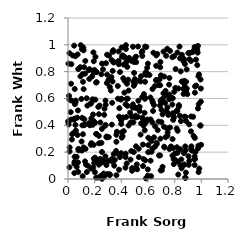
| Category | Series 0 |
|---|---|
| 0.03563302966450452 | 0.921 |
| 0.15725470546570997 | 0.416 |
| 0.30591438788167596 | 0.312 |
| 0.44442905802895954 | 0.835 |
| 0.5340514019186466 | 0.734 |
| 0.07893503927534722 | 0.213 |
| 0.6254720741834504 | 0.283 |
| 0.9351083508665092 | 0.946 |
| 0.5096278023998341 | 0.083 |
| 0.7646215727333777 | 0.384 |
| 0.44600414170575103 | 0.545 |
| 0.7216394145949058 | 0.764 |
| 0.8320018416825582 | 0.55 |
| 0.32900688421911745 | 0.406 |
| 0.709395573126925 | 0.482 |
| 0.2827878612417799 | 0.402 |
| 0.5443690685158465 | 0.727 |
| 0.6652407143829242 | 0.26 |
| 0.4169189847666831 | 0.853 |
| 0.5574837324675022 | 0.456 |
| 0.40282279622567524 | 0.308 |
| 0.6108446168091833 | 0.774 |
| 0.8815692867406937 | 0.462 |
| 0.012519489059148002 | 0.235 |
| 0.10437489069999399 | 0.967 |
| 0.7888248850764427 | 0.44 |
| 0.5953873154129009 | 0.443 |
| 0.1165228921376896 | 0.235 |
| 0.0777591043655525 | 0.225 |
| 0.49057272217372655 | 0.422 |
| 0.5478502889428372 | 0.766 |
| 0.19061189964677616 | 0.943 |
| 0.9052758802610906 | 0.105 |
| 0.07208225706951615 | 0.929 |
| 0.5364906254664229 | 0.538 |
| 0.34676503743022435 | 0.099 |
| 0.34072524804923493 | 0.95 |
| 0.4935841741137938 | 0.201 |
| 0.6264411466432885 | 0.203 |
| 0.07679006643516732 | 0.819 |
| 0.05717907458786809 | 0.584 |
| 0.700557759395515 | 0.425 |
| 0.5834725574929299 | 0.796 |
| 0.07466112687250843 | 0.511 |
| 0.7198555151066441 | 0.389 |
| 0.8417674934536472 | 0.222 |
| 0.04613624099264977 | 0.994 |
| 0.1455468854350774 | 0.547 |
| 0.853430407727154 | 0.727 |
| 0.6325949767257182 | 0.422 |
| 0.20612186753274078 | 0.911 |
| 0.881762902901905 | 0.214 |
| 0.06862611128302931 | 0.457 |
| 0.8667332366656515 | 0.634 |
| 0.5444251770319276 | 0.331 |
| 0.7838020714236587 | 0.174 |
| 0.5240308898563995 | 0.463 |
| 0.8744443689488591 | 0.465 |
| 0.05657004191745656 | 0.915 |
| 0.6447943794131817 | 0.551 |
| 0.2715642921101478 | 0.478 |
| 0.3453617172842169 | 0.871 |
| 0.9234217345973891 | 0.228 |
| 0.2285788836759919 | 0.011 |
| 0.20183481233485892 | 0.051 |
| 0.12916570348441983 | 0.786 |
| 0.8670602330831357 | 0.876 |
| 0.37488271229091713 | 0.599 |
| 0.18407499231285784 | 0.594 |
| 0.20259699793496067 | 0.159 |
| 0.5113440360093787 | 0.871 |
| 0.695132469357539 | 0.064 |
| 0.18132555514791554 | 0.765 |
| 0.24702895944130027 | 0.023 |
| 0.40399143325103937 | 0.347 |
| 0.046087987345045656 | 0.443 |
| 0.506792610633061 | 0.472 |
| 0.9825010202327943 | 0.779 |
| 0.8259075600507771 | 0.13 |
| 0.652661549607466 | 0.242 |
| 0.516196099518228 | 0.109 |
| 0.8726493535969565 | 0.891 |
| 0.8147084099534795 | 0.376 |
| 0.6014727990503329 | 0.2 |
| 0.49056151615090515 | 0.725 |
| 0.19343805210877565 | 0.151 |
| 0.3799780550042329 | 0.95 |
| 0.9100119515219347 | 0.135 |
| 0.27907445741111997 | 0.397 |
| 0.8308764308485884 | 0.538 |
| 0.19651179912720457 | 0.119 |
| 0.8203457588522839 | 0.942 |
| 0.9384938945323787 | 0.464 |
| 0.1983085175587379 | 0.813 |
| 0.9420459151622673 | 0.321 |
| 0.948632118701561 | 0.966 |
| 0.02903005044382853 | 0.295 |
| 0.923114341552792 | 0.466 |
| 0.7459756437684457 | 0.322 |
| 0.4777339687497904 | 0.464 |
| 0.43054982523759133 | 0.084 |
| 0.43170767440450586 | 0.557 |
| 0.2554476945530713 | 0.001 |
| 0.4024363384870739 | 0.98 |
| 0.6966495696412025 | 0.772 |
| 0.1613771927019352 | 0.819 |
| 0.21165359271136697 | 0.796 |
| 0.3963635155993166 | 0.592 |
| 0.46941298226638856 | 0.421 |
| 0.8820308309478597 | 0.009 |
| 0.7824669315075276 | 0.908 |
| 0.44014120768382853 | 0.597 |
| 0.25041341025791447 | 0.78 |
| 0.5015383314833852 | 0.745 |
| 0.7653703418222585 | 0.955 |
| 0.20358605201255797 | 0.419 |
| 0.3630327553735267 | 0.029 |
| 0.8152538842195785 | 0.506 |
| 0.17556850507719263 | 0.267 |
| 0.4328513422570683 | 0.189 |
| 0.010266241414984313 | 0.593 |
| 0.7216116522842217 | 0.241 |
| 0.9221885897266981 | 0.355 |
| 0.5793351780751608 | 0.139 |
| 0.31307573939561534 | 0.686 |
| 0.2138391260776985 | 0.798 |
| 0.3735617436172606 | 0.693 |
| 0.011008889289695527 | 0.937 |
| 0.8846860983848713 | 0.047 |
| 0.2807629415855507 | 0.169 |
| 0.9844252891726221 | 0.078 |
| 0.7968187977232787 | 0.65 |
| 0.43157071224319604 | 0.164 |
| 0.20532045447148634 | 0.592 |
| 0.8225814183010978 | 0.359 |
| 0.7384080433089355 | 0.507 |
| 0.6728793603267023 | 0.364 |
| 0.21057979706823254 | 0.719 |
| 0.5780158165397067 | 0.987 |
| 0.5922188670633197 | 0.786 |
| 0.9788437487020605 | 0.765 |
| 0.5858339328218688 | 0.776 |
| 0.36703647269313144 | 0.352 |
| 0.23711753986353387 | 0.548 |
| 0.569033431424668 | 0.633 |
| 0.040454871515054766 | 0.342 |
| 0.974338953810855 | 0.992 |
| 0.456478630369994 | 0.89 |
| 0.24212569490626637 | 0.119 |
| 0.26909047843936196 | 0.015 |
| 0.7474323135710214 | 0.348 |
| 0.14136893046923868 | 0.052 |
| 0.9495105727749563 | 0.104 |
| 0.5275154171254685 | 0.583 |
| 0.44006459427832584 | 0.116 |
| 0.8386461248547867 | 0.471 |
| 0.6629088393247221 | 0.737 |
| 0.4957352171128078 | 0.791 |
| 0.4938256890846566 | 0.872 |
| 0.38227632549541446 | 0.855 |
| 0.049520682179997846 | 0.166 |
| 0.11745239315813702 | 0.67 |
| 0.7613593107569053 | 0.224 |
| 0.7459999700498012 | 0.534 |
| 0.8854379822208005 | 0.724 |
| 0.2542735645275871 | 0.012 |
| 0.04788185699979842 | 0.114 |
| 0.598978069813513 | 0.86 |
| 0.9795716258534691 | 0.052 |
| 0.2929157352323847 | 0.926 |
| 0.6900919024135728 | 0.548 |
| 0.10059475263461078 | 0.597 |
| 0.26254674912036746 | 0.818 |
| 0.7315642364723096 | 0.311 |
| 0.5481818017063093 | 0.415 |
| 0.5938202570976902 | 0.828 |
| 0.02793645959232622 | 0.444 |
| 0.36150511948355074 | 0.191 |
| 0.48732592023902943 | 0.986 |
| 0.5757007799252084 | 0.363 |
| 0.2676635024097591 | 0.041 |
| 0.12086776030227603 | 0.834 |
| 0.8782469905607037 | 0.009 |
| 0.8405641931578546 | 0.899 |
| 0.7950499140761986 | 0.459 |
| 0.7278126319315674 | 0.568 |
| 0.17115419369886564 | 0.255 |
| 0.022932409541389347 | 0.71 |
| 0.9694812066911285 | 0.849 |
| 0.5367169282239092 | 0.507 |
| 0.17507905280692734 | 0.451 |
| 0.3131967644961714 | 0.035 |
| 0.5669103606655168 | 0.149 |
| 0.1928892950751433 | 0.254 |
| 0.879530991236594 | 0.243 |
| 0.8271180111415063 | 0.033 |
| 0.2882903429011712 | 0.104 |
| 0.4745602771057324 | 0.208 |
| 0.7849345924758124 | 0.602 |
| 0.5025547744859902 | 0.903 |
| 0.6021950732527096 | 0.308 |
| 0.3014052505391087 | 0.135 |
| 0.4358913917001129 | 0.869 |
| 0.507910574968093 | 0.529 |
| 0.3969783337334159 | 0.44 |
| 0.2646050397892574 | 0.138 |
| 0.0005574729176645356 | 0.428 |
| 0.313532790448222 | 0.029 |
| 0.6694866761948005 | 0.932 |
| 0.342883475329843 | 0.186 |
| 0.8519406687588789 | 0.08 |
| 0.5303410280447448 | 0.226 |
| 0.5572700705394731 | 0.953 |
| 0.7009646558975562 | 0.517 |
| 0.44796516853020724 | 0.599 |
| 0.42274635812048394 | 0.907 |
| 0.012529329909304998 | 0.437 |
| 0.0245749698531523 | 0.585 |
| 0.602326077256067 | 0.252 |
| 0.6512072730822507 | 0.692 |
| 0.6233127587818089 | 0.021 |
| 0.37947488451029465 | 0.88 |
| 0.41179851804807915 | 0.458 |
| 0.003611323676144655 | 0.86 |
| 0.17317977715319022 | 0.078 |
| 0.5099137580260154 | 0.912 |
| 0.15988606194727195 | 0.746 |
| 0.211175598901983 | 0.01 |
| 0.1281676497530065 | 0.131 |
| 0.7376308685766668 | 0.626 |
| 0.7720333134261967 | 0.243 |
| 0.6195118935137789 | 0.136 |
| 0.048982232315203385 | 0.128 |
| 0.32102537646652235 | 0.66 |
| 0.2562054198628006 | 0.125 |
| 0.4551969705650018 | 0.659 |
| 0.7093359182497552 | 0.091 |
| 0.75792692565497 | 0.703 |
| 0.7365395766182852 | 0.918 |
| 0.7159463593079847 | 0.638 |
| 0.51873906147359 | 0.53 |
| 0.42366907079564203 | 0.911 |
| 0.5673319027242409 | 0.443 |
| 0.18889241934662354 | 0.087 |
| 0.2197120930957334 | 0.141 |
| 0.128715253506514 | 0.406 |
| 0.690650452279434 | 0.176 |
| 0.2314413330652895 | 0.107 |
| 0.09195891316836974 | 0.833 |
| 0.5984238046564304 | 0.072 |
| 0.694457885708973 | 0.584 |
| 0.2408471491853137 | 0.149 |
| 0.11260882861839408 | 0.724 |
| 0.8436016047949935 | 0.102 |
| 0.6985252735834838 | 0.568 |
| 0.80243701097228 | 0.144 |
| 0.5797758974919436 | 0.786 |
| 0.9562078556034115 | 0.202 |
| 0.9223339599110065 | 0.88 |
| 0.7604258070665407 | 0.629 |
| 0.8284535498763268 | 0.675 |
| 0.6867192214500074 | 0.742 |
| 0.7529465901011347 | 0.477 |
| 0.33455310354635626 | 0.95 |
| 0.5314072960723647 | 0.163 |
| 0.10789472090017038 | 0.4 |
| 0.293630596018723 | 0.778 |
| 0.02518692620950425 | 0.856 |
| 0.951848482008087 | 0.643 |
| 0.25505948593582295 | 0.86 |
| 0.9747641722720838 | 0.526 |
| 0.0557906952787155 | 0.403 |
| 0.711023790113029 | 0.599 |
| 0.04793591548597913 | 0.449 |
| 0.8900216219620398 | 0.817 |
| 0.25499612887224316 | 0.201 |
| 0.15642243299990227 | 0.813 |
| 0.33921064785245064 | 0.96 |
| 0.6329181984823714 | 0.225 |
| 0.33126710947712823 | 0.568 |
| 0.23109765785387412 | 0.321 |
| 0.8498076276016545 | 0.146 |
| 0.5059089369762515 | 0.459 |
| 0.8624726256687688 | 0.899 |
| 0.4013359382570367 | 0.44 |
| 0.13162641318208185 | 0.225 |
| 0.6182379878813861 | 0.608 |
| 0.4764774288556958 | 0.881 |
| 0.05052740854410845 | 0.671 |
| 0.9750081381616671 | 0.228 |
| 0.5187729486442696 | 0.072 |
| 0.4933816770562184 | 0.695 |
| 0.760512002606415 | 0.753 |
| 0.2141794405450376 | 0.336 |
| 0.5314142843297285 | 0.533 |
| 0.6198059575564631 | 0.444 |
| 0.653344253120859 | 0.393 |
| 0.5664838800685154 | 0.398 |
| 0.5873613995009107 | 0.984 |
| 0.1350972405354689 | 0.107 |
| 0.736805000963697 | 0.507 |
| 0.5013211644831052 | 0.711 |
| 0.3272702271633906 | 0.886 |
| 0.8697720512573691 | 0.193 |
| 0.48040063664341437 | 0.061 |
| 0.17538542395401033 | 0.569 |
| 0.3039389120748949 | 0.738 |
| 0.7830865406310932 | 0.602 |
| 0.6337103809996529 | 0.671 |
| 0.993908060345206 | 0.398 |
| 0.05163631632914163 | 0.558 |
| 0.5740055816568224 | 0.493 |
| 0.42490728968316016 | 0.732 |
| 0.4091902081889267 | 0.319 |
| 0.43420789183573444 | 0.969 |
| 0.5775258174955324 | 0.725 |
| 0.19342545939076447 | 0.878 |
| 0.3629497424795316 | 0.277 |
| 0.959554842559549 | 0.89 |
| 0.8744027072092061 | 0.108 |
| 0.25067901260069686 | 0.269 |
| 0.05683946911173523 | 0.572 |
| 0.8217925767364603 | 0.196 |
| 0.4855958588978033 | 0.534 |
| 0.14027993346530274 | 0.602 |
| 0.2427795825093962 | 0.422 |
| 0.07655118207465719 | 0.053 |
| 0.6447244011553399 | 0.311 |
| 0.5786906137587574 | 0.605 |
| 0.6592831777167175 | 0.737 |
| 0.4342654209563518 | 0.997 |
| 0.9922312821111346 | 0.399 |
| 0.9277749944670275 | 0.214 |
| 0.4231945154855341 | 0.643 |
| 0.01086705372507351 | 0.087 |
| 0.9513267593406427 | 0.306 |
| 0.38275620015818584 | 0.069 |
| 0.6797627918332869 | 0.7 |
| 0.9724298477668297 | 0.942 |
| 0.10433711230629453 | 0.212 |
| 0.0748666413072164 | 0.123 |
| 0.16410124581590813 | 0.4 |
| 0.3606279211977672 | 0.209 |
| 0.48682916046004615 | 0.556 |
| 0.8037300707078101 | 0.19 |
| 0.7439009660855376 | 0.378 |
| 0.3904900566429923 | 0.797 |
| 0.5625858119689862 | 0.097 |
| 0.946579590666628 | 0.148 |
| 0.7874268681181444 | 0.231 |
| 0.6792330957768924 | 0.428 |
| 0.18503096642113592 | 0.404 |
| 0.9808727107591058 | 0.558 |
| 0.32845741310752624 | 0.148 |
| 0.7953689488854828 | 0.915 |
| 0.7313190142640936 | 0.657 |
| 0.7936542421111711 | 0.111 |
| 0.7237428150495168 | 0.235 |
| 0.007584717321694896 | 0.62 |
| 0.4366114385954635 | 0.462 |
| 0.8769785914278284 | 0.857 |
| 0.6912296006285414 | 0.699 |
| 0.7039255273517013 | 0.065 |
| 0.9519490435236196 | 0.149 |
| 0.48733910987513346 | 0.534 |
| 0.5830640754805679 | 0.42 |
| 0.06522409125087772 | 0.091 |
| 0.05891495219034428 | 0.361 |
| 0.9037024288878586 | 0.17 |
| 0.7592603970731653 | 0.595 |
| 0.8049713732043522 | 0.679 |
| 0.5569273766421193 | 0.917 |
| 0.9089840911533312 | 0.407 |
| 0.28877277461813117 | 0.316 |
| 0.5249818244414187 | 0.987 |
| 0.19204042486231032 | 0.795 |
| 0.18792496951301238 | 0.481 |
| 0.7859463342809258 | 0.49 |
| 0.22704405631666255 | 0.537 |
| 0.0116680905359288 | 0.205 |
| 0.6932412210827171 | 0.872 |
| 0.41420133352761423 | 0.751 |
| 0.10946577729115292 | 0.782 |
| 0.21096971327528388 | 0.336 |
| 0.996487624812944 | 0.577 |
| 0.8946709214049935 | 0.632 |
| 0.9025720755159009 | 0.939 |
| 0.6613435397877716 | 0.844 |
| 0.12971264117875198 | 0.88 |
| 0.8361975833811653 | 0.987 |
| 0.8451576792464932 | 0.802 |
| 0.3352131843278119 | 0.806 |
| 0.6625032496590543 | 0.921 |
| 0.599491164879783 | 0.78 |
| 0.4660603423222704 | 0.495 |
| 0.2915982257335214 | 0.716 |
| 0.4515146889561177 | 0.74 |
| 0.48136392587981724 | 0.082 |
| 0.020085167966461055 | 0.498 |
| 0.8172231142759561 | 0.508 |
| 0.2850305880861073 | 0.863 |
| 0.4043866458823481 | 0.912 |
| 0.784346113505831 | 0.297 |
| 0.8731682782325872 | 0.732 |
| 0.3851934162484314 | 0.528 |
| 0.5529397167340958 | 0.942 |
| 0.9330599009858545 | 0.211 |
| 0.6357515468751586 | 0.568 |
| 0.7826473626687894 | 0.555 |
| 0.0044690605382460774 | 0.406 |
| 0.1207060477242378 | 0.402 |
| 0.6930788836665565 | 0.301 |
| 0.2969562752617016 | 0.037 |
| 0.27370327637094827 | 0.524 |
| 0.8653336044353431 | 0.672 |
| 0.9964753408185877 | 0.674 |
| 0.2153561302551363 | 0.721 |
| 0.9497723236907527 | 0.984 |
| 0.6914853348807706 | 0.833 |
| 0.41836379576152954 | 0.357 |
| 0.4425550789377365 | 0.71 |
| 0.06494032317075081 | 0.165 |
| 0.12282620969115982 | 0.445 |
| 0.5571712458515781 | 0.611 |
| 0.11209407800486872 | 0.334 |
| 0.10996349321437712 | 0.021 |
| 0.6207159801741702 | 0.293 |
| 0.23237988545417773 | 0.266 |
| 0.45802438684461444 | 0.902 |
| 0.454273555592939 | 0.399 |
| 0.11471077224702414 | 0.98 |
| 0.3511081279977127 | 0.142 |
| 0.8851303554977431 | 0.432 |
| 0.1930128685593802 | 0.432 |
| 0.8071347555982133 | 0.819 |
| 0.32562476280472585 | 0.759 |
| 0.8664629832888565 | 0.103 |
| 0.8198312944952835 | 0.509 |
| 0.10206029775569704 | 0.28 |
| 0.9982319626118169 | 0.255 |
| 0.09554324575798391 | 0.998 |
| 0.33331839076790826 | 0.129 |
| 0.9616294371567543 | 0.696 |
| 0.978444188337748 | 0.248 |
| 0.1493160588495514 | 0.099 |
| 0.8469003443288069 | 0.431 |
| 0.994249274136531 | 0.742 |
| 0.10619791453866156 | 0.456 |
| 0.8172893917611077 | 0.237 |
| 0.39921409726414875 | 0.192 |
| 0.46908411457433297 | 0.144 |
| 0.1689619579568536 | 0.561 |
| 0.04756132354658315 | 0.045 |
| 0.07127633886611802 | 0.328 |
| 0.7446247070676865 | 0.971 |
| 0.2046603228727309 | 0.139 |
| 0.8697422869491769 | 0.713 |
| 0.38292021036468565 | 0.465 |
| 0.5622327210181942 | 0.257 |
| 0.7889932361414783 | 0.474 |
| 0.8761381477012877 | 0.687 |
| 0.6332193884908315 | 0.582 |
| 0.7587608758511319 | 0.483 |
| 0.23199054675420633 | 0.483 |
| 0.1171376210673989 | 0.959 |
| 0.5770900590585127 | 0.597 |
| 0.9689155489687573 | 0.967 |
| 0.40163583354537924 | 0.598 |
| 0.890681307694469 | 0.674 |
| 0.2544782081637083 | 0.373 |
| 0.28915161482548163 | 0.311 |
| 0.34123891969535974 | 0.869 |
| 0.41152673524219324 | 0.921 |
| 0.9100259312667041 | 0.893 |
| 0.17728498901798603 | 0.412 |
| 0.30849792822954397 | 0.92 |
| 0.7924495351965801 | 0.148 |
| 0.8859930711200099 | 0.658 |
| 0.5097429639025974 | 0.244 |
| 0.09325274618908413 | 0.765 |
| 0.03117565710810131 | 0.334 |
| 0.5611259777638714 | 0.416 |
| 0.9499102138435954 | 0.169 |
| 0.2813078095981095 | 0.584 |
| 0.9529682562104622 | 0.691 |
| 0.925386894094774 | 0.243 |
| 0.8540930413241055 | 0.926 |
| 0.7162909750622759 | 0.949 |
| 0.6376503760180774 | 0.507 |
| 0.5846231153621883 | 0.004 |
| 0.6652291644097992 | 0.27 |
| 0.6827189541276671 | 0.175 |
| 0.6410274290690012 | 0.941 |
| 0.28266889472750867 | 0.552 |
| 0.5986921831132677 | 0.025 |
| 0.3893049764838083 | 0.163 |
| 0.33428067900828884 | 0.727 |
| 0.3629972393716073 | 0.33 |
| 0.915005927565655 | 0.94 |
| 0.39927718558609027 | 0.41 |